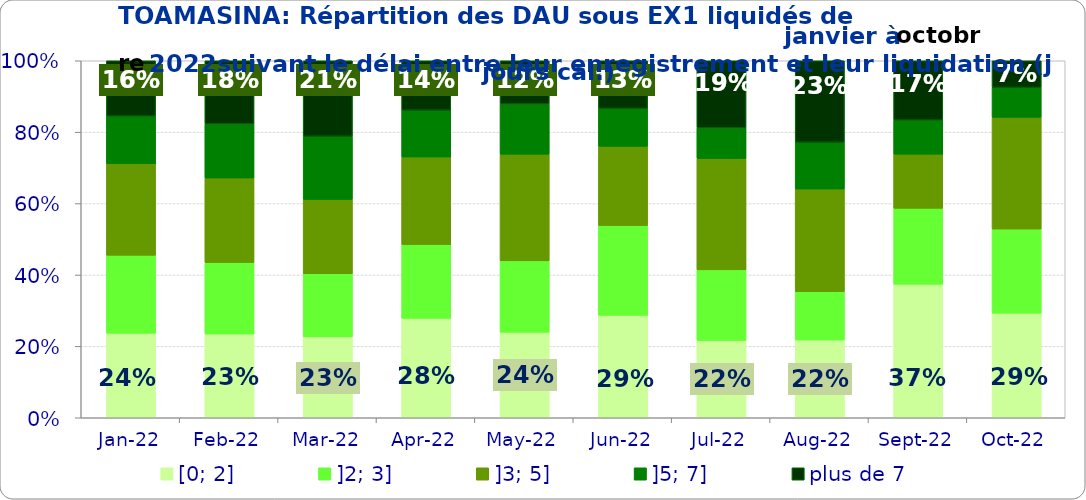
| Category | [0; 2] | ]2; 3] | ]3; 5] | ]5; 7] | plus de 7 |
|---|---|---|---|---|---|
| 2022-01-01 | 0.237 | 0.219 | 0.256 | 0.133 | 0.155 |
| 2022-02-01 | 0.235 | 0.2 | 0.236 | 0.152 | 0.177 |
| 2022-03-01 | 0.227 | 0.177 | 0.208 | 0.177 | 0.212 |
| 2022-04-01 | 0.278 | 0.207 | 0.245 | 0.131 | 0.138 |
| 2022-05-01 | 0.24 | 0.2 | 0.299 | 0.141 | 0.121 |
| 2022-06-01 | 0.287 | 0.251 | 0.222 | 0.106 | 0.134 |
| 2022-07-01 | 0.217 | 0.198 | 0.312 | 0.086 | 0.188 |
| 2022-08-01 | 0.218 | 0.135 | 0.288 | 0.131 | 0.228 |
| 2022-09-01 | 0.374 | 0.213 | 0.152 | 0.095 | 0.166 |
| 2022-10-01 | 0.293 | 0.236 | 0.313 | 0.084 | 0.075 |